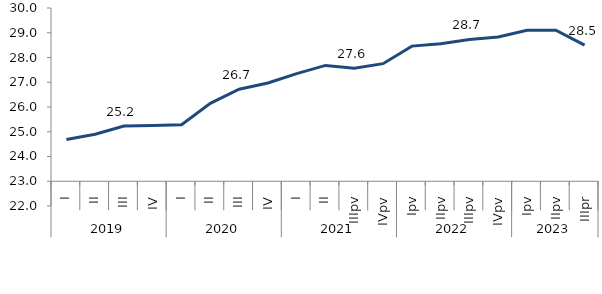
| Category | Series 0 |
|---|---|
| 0 | 24.69 |
| 1900-01-01 | 24.9 |
| 1900-01-02 | 25.23 |
| 1900-01-03 | 25.25 |
| 1900-01-04 | 25.28 |
| 1900-01-05 | 26.15 |
| 1900-01-06 | 26.72 |
| 1900-01-07 | 26.97 |
| 1900-01-08 | 27.35 |
| 1900-01-09 | 27.68 |
| 1900-01-10 | 27.57 |
| 1900-01-11 | 27.75 |
| 1900-01-12 | 28.46 |
| 1900-01-13 | 28.56 |
| 1900-01-14 | 28.73 |
| 1900-01-15 | 28.83 |
| 1900-01-16 | 29.1 |
| 1900-01-17 | 29.1 |
| 1900-01-18 | 28.5 |